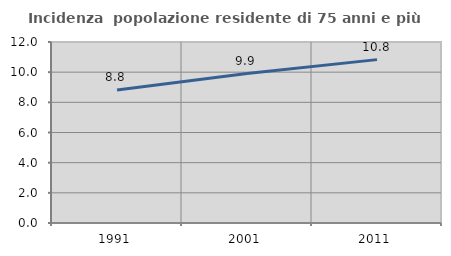
| Category | Incidenza  popolazione residente di 75 anni e più |
|---|---|
| 1991.0 | 8.818 |
| 2001.0 | 9.906 |
| 2011.0 | 10.832 |